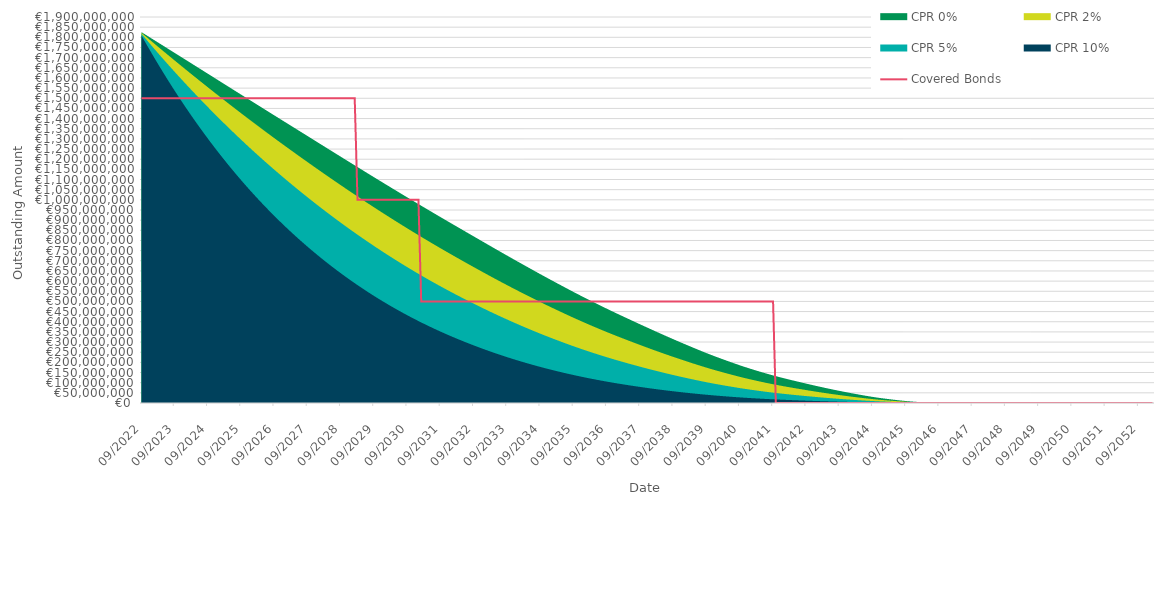
| Category | Covered Bonds |
|---|---|
| 2022-09-30 | 1500000000 |
| 2022-10-31 | 1500000000 |
| 2022-11-30 | 1500000000 |
| 2022-12-31 | 1500000000 |
| 2023-01-31 | 1500000000 |
| 2023-02-28 | 1500000000 |
| 2023-03-31 | 1500000000 |
| 2023-04-30 | 1500000000 |
| 2023-05-31 | 1500000000 |
| 2023-06-30 | 1500000000 |
| 2023-07-31 | 1500000000 |
| 2023-08-31 | 1500000000 |
| 2023-09-30 | 1500000000 |
| 2023-10-31 | 1500000000 |
| 2023-11-30 | 1500000000 |
| 2023-12-31 | 1500000000 |
| 2024-01-31 | 1500000000 |
| 2024-02-29 | 1500000000 |
| 2024-03-31 | 1500000000 |
| 2024-04-30 | 1500000000 |
| 2024-05-31 | 1500000000 |
| 2024-06-30 | 1500000000 |
| 2024-07-31 | 1500000000 |
| 2024-08-31 | 1500000000 |
| 2024-09-30 | 1500000000 |
| 2024-10-31 | 1500000000 |
| 2024-11-30 | 1500000000 |
| 2024-12-31 | 1500000000 |
| 2025-01-31 | 1500000000 |
| 2025-02-28 | 1500000000 |
| 2025-03-31 | 1500000000 |
| 2025-04-30 | 1500000000 |
| 2025-05-31 | 1500000000 |
| 2025-06-30 | 1500000000 |
| 2025-07-31 | 1500000000 |
| 2025-08-31 | 1500000000 |
| 2025-09-30 | 1500000000 |
| 2025-10-31 | 1500000000 |
| 2025-11-30 | 1500000000 |
| 2025-12-31 | 1500000000 |
| 2026-01-31 | 1500000000 |
| 2026-02-28 | 1500000000 |
| 2026-03-31 | 1500000000 |
| 2026-04-30 | 1500000000 |
| 2026-05-31 | 1500000000 |
| 2026-06-30 | 1500000000 |
| 2026-07-31 | 1500000000 |
| 2026-08-31 | 1500000000 |
| 2026-09-30 | 1500000000 |
| 2026-10-31 | 1500000000 |
| 2026-11-30 | 1500000000 |
| 2026-12-31 | 1500000000 |
| 2027-01-31 | 1500000000 |
| 2027-02-28 | 1500000000 |
| 2027-03-31 | 1500000000 |
| 2027-04-30 | 1500000000 |
| 2027-05-31 | 1500000000 |
| 2027-06-30 | 1500000000 |
| 2027-07-31 | 1500000000 |
| 2027-08-31 | 1500000000 |
| 2027-09-30 | 1500000000 |
| 2027-10-31 | 1500000000 |
| 2027-11-30 | 1500000000 |
| 2027-12-31 | 1500000000 |
| 2028-01-31 | 1500000000 |
| 2028-02-29 | 1500000000 |
| 2028-03-31 | 1500000000 |
| 2028-04-30 | 1500000000 |
| 2028-05-31 | 1500000000 |
| 2028-06-30 | 1500000000 |
| 2028-07-31 | 1500000000 |
| 2028-08-31 | 1500000000 |
| 2028-09-30 | 1500000000 |
| 2028-10-31 | 1500000000 |
| 2028-11-30 | 1500000000 |
| 2028-12-31 | 1500000000 |
| 2029-01-31 | 1500000000 |
| 2029-02-28 | 1500000000 |
| 2029-03-31 | 1000000000 |
| 2029-04-30 | 1000000000 |
| 2029-05-31 | 1000000000 |
| 2029-06-30 | 1000000000 |
| 2029-07-31 | 1000000000 |
| 2029-08-31 | 1000000000 |
| 2029-09-30 | 1000000000 |
| 2029-10-31 | 1000000000 |
| 2029-11-30 | 1000000000 |
| 2029-12-31 | 1000000000 |
| 2030-01-31 | 1000000000 |
| 2030-02-28 | 1000000000 |
| 2030-03-31 | 1000000000 |
| 2030-04-30 | 1000000000 |
| 2030-05-31 | 1000000000 |
| 2030-06-30 | 1000000000 |
| 2030-07-31 | 1000000000 |
| 2030-08-31 | 1000000000 |
| 2030-09-30 | 1000000000 |
| 2030-10-31 | 1000000000 |
| 2030-11-30 | 1000000000 |
| 2030-12-31 | 1000000000 |
| 2031-01-31 | 1000000000 |
| 2031-02-28 | 500000000 |
| 2031-03-31 | 500000000 |
| 2031-04-30 | 500000000 |
| 2031-05-31 | 500000000 |
| 2031-06-30 | 500000000 |
| 2031-07-31 | 500000000 |
| 2031-08-31 | 500000000 |
| 2031-09-30 | 500000000 |
| 2031-10-31 | 500000000 |
| 2031-11-30 | 500000000 |
| 2031-12-31 | 500000000 |
| 2032-01-31 | 500000000 |
| 2032-02-29 | 500000000 |
| 2032-03-31 | 500000000 |
| 2032-04-30 | 500000000 |
| 2032-05-31 | 500000000 |
| 2032-06-30 | 500000000 |
| 2032-07-31 | 500000000 |
| 2032-08-31 | 500000000 |
| 2032-09-30 | 500000000 |
| 2032-10-31 | 500000000 |
| 2032-11-30 | 500000000 |
| 2032-12-31 | 500000000 |
| 2033-01-31 | 500000000 |
| 2033-02-28 | 500000000 |
| 2033-03-31 | 500000000 |
| 2033-04-30 | 500000000 |
| 2033-05-31 | 500000000 |
| 2033-06-30 | 500000000 |
| 2033-07-31 | 500000000 |
| 2033-08-31 | 500000000 |
| 2033-09-30 | 500000000 |
| 2033-10-31 | 500000000 |
| 2033-11-30 | 500000000 |
| 2033-12-31 | 500000000 |
| 2034-01-31 | 500000000 |
| 2034-02-28 | 500000000 |
| 2034-03-31 | 500000000 |
| 2034-04-30 | 500000000 |
| 2034-05-31 | 500000000 |
| 2034-06-30 | 500000000 |
| 2034-07-31 | 500000000 |
| 2034-08-31 | 500000000 |
| 2034-09-30 | 500000000 |
| 2034-10-31 | 500000000 |
| 2034-11-30 | 500000000 |
| 2034-12-31 | 500000000 |
| 2035-01-31 | 500000000 |
| 2035-02-28 | 500000000 |
| 2035-03-31 | 500000000 |
| 2035-04-30 | 500000000 |
| 2035-05-31 | 500000000 |
| 2035-06-30 | 500000000 |
| 2035-07-31 | 500000000 |
| 2035-08-31 | 500000000 |
| 2035-09-30 | 500000000 |
| 2035-10-31 | 500000000 |
| 2035-11-30 | 500000000 |
| 2035-12-31 | 500000000 |
| 2036-01-31 | 500000000 |
| 2036-02-29 | 500000000 |
| 2036-03-31 | 500000000 |
| 2036-04-30 | 500000000 |
| 2036-05-31 | 500000000 |
| 2036-06-30 | 500000000 |
| 2036-07-31 | 500000000 |
| 2036-08-31 | 500000000 |
| 2036-09-30 | 500000000 |
| 2036-10-31 | 500000000 |
| 2036-11-30 | 500000000 |
| 2036-12-31 | 500000000 |
| 2037-01-31 | 500000000 |
| 2037-02-28 | 500000000 |
| 2037-03-31 | 500000000 |
| 2037-04-30 | 500000000 |
| 2037-05-31 | 500000000 |
| 2037-06-30 | 500000000 |
| 2037-07-31 | 500000000 |
| 2037-08-31 | 500000000 |
| 2037-09-30 | 500000000 |
| 2037-10-31 | 500000000 |
| 2037-11-30 | 500000000 |
| 2037-12-31 | 500000000 |
| 2038-01-31 | 500000000 |
| 2038-02-28 | 500000000 |
| 2038-03-31 | 500000000 |
| 2038-04-30 | 500000000 |
| 2038-05-31 | 500000000 |
| 2038-06-30 | 500000000 |
| 2038-07-31 | 500000000 |
| 2038-08-31 | 500000000 |
| 2038-09-30 | 500000000 |
| 2038-10-31 | 500000000 |
| 2038-11-30 | 500000000 |
| 2038-12-31 | 500000000 |
| 2039-01-31 | 500000000 |
| 2039-02-28 | 500000000 |
| 2039-03-31 | 500000000 |
| 2039-04-30 | 500000000 |
| 2039-05-31 | 500000000 |
| 2039-06-30 | 500000000 |
| 2039-07-31 | 500000000 |
| 2039-08-31 | 500000000 |
| 2039-09-30 | 500000000 |
| 2039-10-31 | 500000000 |
| 2039-11-30 | 500000000 |
| 2039-12-31 | 500000000 |
| 2040-01-31 | 500000000 |
| 2040-02-29 | 500000000 |
| 2040-03-31 | 500000000 |
| 2040-04-30 | 500000000 |
| 2040-05-31 | 500000000 |
| 2040-06-30 | 500000000 |
| 2040-07-31 | 500000000 |
| 2040-08-31 | 500000000 |
| 2040-09-30 | 500000000 |
| 2040-10-31 | 500000000 |
| 2040-11-30 | 500000000 |
| 2040-12-31 | 500000000 |
| 2041-01-31 | 500000000 |
| 2041-02-28 | 500000000 |
| 2041-03-31 | 500000000 |
| 2041-04-30 | 500000000 |
| 2041-05-31 | 500000000 |
| 2041-06-30 | 500000000 |
| 2041-07-31 | 500000000 |
| 2041-08-31 | 500000000 |
| 2041-09-30 | 500000000 |
| 2041-10-31 | 0 |
| 2041-11-30 | 0 |
| 2041-12-31 | 0 |
| 2042-01-31 | 0 |
| 2042-02-28 | 0 |
| 2042-03-31 | 0 |
| 2042-04-30 | 0 |
| 2042-05-31 | 0 |
| 2042-06-30 | 0 |
| 2042-07-31 | 0 |
| 2042-08-31 | 0 |
| 2042-09-30 | 0 |
| 2042-10-31 | 0 |
| 2042-11-30 | 0 |
| 2042-12-31 | 0 |
| 2043-01-31 | 0 |
| 2043-02-28 | 0 |
| 2043-03-31 | 0 |
| 2043-04-30 | 0 |
| 2043-05-31 | 0 |
| 2043-06-30 | 0 |
| 2043-07-31 | 0 |
| 2043-08-31 | 0 |
| 2043-09-30 | 0 |
| 2043-10-31 | 0 |
| 2043-11-30 | 0 |
| 2043-12-31 | 0 |
| 2044-01-31 | 0 |
| 2044-02-29 | 0 |
| 2044-03-31 | 0 |
| 2044-04-30 | 0 |
| 2044-05-31 | 0 |
| 2044-06-30 | 0 |
| 2044-07-31 | 0 |
| 2044-08-31 | 0 |
| 2044-09-30 | 0 |
| 2044-10-31 | 0 |
| 2044-11-30 | 0 |
| 2044-12-31 | 0 |
| 2045-01-31 | 0 |
| 2045-02-28 | 0 |
| 2045-03-31 | 0 |
| 2045-04-30 | 0 |
| 2045-05-31 | 0 |
| 2045-06-30 | 0 |
| 2045-07-31 | 0 |
| 2045-08-31 | 0 |
| 2045-09-30 | 0 |
| 2045-10-31 | 0 |
| 2045-11-30 | 0 |
| 2045-12-31 | 0 |
| 2046-01-31 | 0 |
| 2046-02-28 | 0 |
| 2046-03-31 | 0 |
| 2046-04-30 | 0 |
| 2046-05-31 | 0 |
| 2046-06-30 | 0 |
| 2046-07-31 | 0 |
| 2046-08-31 | 0 |
| 2046-09-30 | 0 |
| 2046-10-31 | 0 |
| 2046-11-30 | 0 |
| 2046-12-31 | 0 |
| 2047-01-31 | 0 |
| 2047-02-28 | 0 |
| 2047-03-31 | 0 |
| 2047-04-30 | 0 |
| 2047-05-31 | 0 |
| 2047-06-30 | 0 |
| 2047-07-31 | 0 |
| 2047-08-31 | 0 |
| 2047-09-30 | 0 |
| 2047-10-31 | 0 |
| 2047-11-30 | 0 |
| 2047-12-31 | 0 |
| 2048-01-31 | 0 |
| 2048-02-29 | 0 |
| 2048-03-31 | 0 |
| 2048-04-30 | 0 |
| 2048-05-31 | 0 |
| 2048-06-30 | 0 |
| 2048-07-31 | 0 |
| 2048-08-31 | 0 |
| 2048-09-30 | 0 |
| 2048-10-31 | 0 |
| 2048-11-30 | 0 |
| 2048-12-31 | 0 |
| 2049-01-31 | 0 |
| 2049-02-28 | 0 |
| 2049-03-31 | 0 |
| 2049-04-30 | 0 |
| 2049-05-31 | 0 |
| 2049-06-30 | 0 |
| 2049-07-31 | 0 |
| 2049-08-31 | 0 |
| 2049-09-30 | 0 |
| 2049-10-31 | 0 |
| 2049-11-30 | 0 |
| 2049-12-31 | 0 |
| 2050-01-31 | 0 |
| 2050-02-28 | 0 |
| 2050-03-31 | 0 |
| 2050-04-30 | 0 |
| 2050-05-31 | 0 |
| 2050-06-30 | 0 |
| 2050-07-31 | 0 |
| 2050-08-31 | 0 |
| 2050-09-30 | 0 |
| 2050-10-31 | 0 |
| 2050-11-30 | 0 |
| 2050-12-31 | 0 |
| 2051-01-31 | 0 |
| 2051-02-28 | 0 |
| 2051-03-31 | 0 |
| 2051-04-30 | 0 |
| 2051-05-31 | 0 |
| 2051-06-30 | 0 |
| 2051-07-31 | 0 |
| 2051-08-31 | 0 |
| 2051-09-30 | 0 |
| 2051-10-31 | 0 |
| 2051-11-30 | 0 |
| 2051-12-31 | 0 |
| 2052-01-31 | 0 |
| 2052-02-29 | 0 |
| 2052-03-31 | 0 |
| 2052-04-30 | 0 |
| 2052-05-31 | 0 |
| 2052-06-30 | 0 |
| 2052-07-31 | 0 |
| 2052-08-31 | 0 |
| 2052-09-30 | 0 |
| 2052-10-31 | 0 |
| 2052-11-30 | 0 |
| 2052-12-31 | 0 |
| 2053-01-31 | 0 |
| 2053-02-28 | 0 |